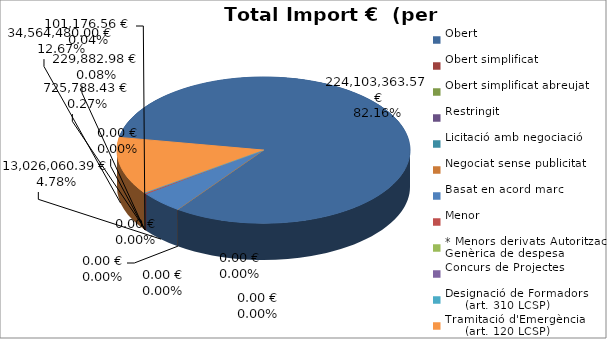
| Category | Total preu
(amb IVA) |
|---|---|
| Obert | 224103363.57 |
| Obert simplificat | 0 |
| Obert simplificat abreujat | 0 |
| Restringit | 0 |
| Licitació amb negociació | 0 |
| Negociat sense publicitat | 0 |
| Basat en acord marc | 13026060.39 |
| Menor | 725788.43 |
| * Menors derivats Autorització Genèrica de despesa | 101176.56 |
| Concurs de Projectes | 0 |
| Designació de Formadors
     (art. 310 LCSP) | 229882.98 |
| Tramitació d'Emergència
     (art. 120 LCSP) | 34564480 |